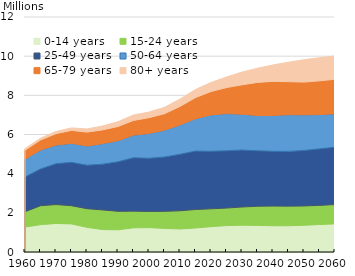
| Category | 0-14 years | 15-24 years | 25-49 years | 50-64 years | 65-79 years | 80+ years |
|---|---|---|---|---|---|---|
| 1960.0 | 1.274 | 0.781 | 1.777 | 0.91 | 0.458 | 0.081 |
| 1965.0 | 1.397 | 0.965 | 1.878 | 0.964 | 0.514 | 0.094 |
| 1970.0 | 1.457 | 0.965 | 2.09 | 0.946 | 0.585 | 0.108 |
| 1975.0 | 1.435 | 0.929 | 2.215 | 0.971 | 0.659 | 0.128 |
| 1980.0 | 1.257 | 0.955 | 2.221 | 0.98 | 0.709 | 0.161 |
| 1985.0 | 1.146 | 1.003 | 2.338 | 1.047 | 0.701 | 0.2 |
| 1990.0 | 1.134 | 0.945 | 2.529 | 1.075 | 0.727 | 0.243 |
| 1995.0 | 1.234 | 0.852 | 2.728 | 1.154 | 0.75 | 0.277 |
| 2000.0 | 1.246 | 0.825 | 2.716 | 1.266 | 0.806 | 0.284 |
| 2005.0 | 1.203 | 0.873 | 2.776 | 1.368 | 0.842 | 0.324 |
| 2010.0 | 1.176 | 0.929 | 2.886 | 1.499 | 0.944 | 0.375 |
| 2015.0 | 1.227 | 0.942 | 2.983 | 1.651 | 1.08 | 0.413 |
| 2020.0 | 1.295 | 0.909 | 2.941 | 1.856 | 1.194 | 0.459 |
| 2025.0 | 1.349 | 0.895 | 2.926 | 1.9 | 1.327 | 0.541 |
| 2030.0 | 1.369 | 0.929 | 2.909 | 1.829 | 1.499 | 0.649 |
| 2035.0 | 1.356 | 0.979 | 2.836 | 1.795 | 1.693 | 0.726 |
| 2040.0 | 1.341 | 1.005 | 2.797 | 1.833 | 1.74 | 0.837 |
| 2045.0 | 1.341 | 1.001 | 2.796 | 1.873 | 1.687 | 0.996 |
| 2050.0 | 1.365 | 0.986 | 2.834 | 1.82 | 1.672 | 1.14 |
| 2055.0 | 1.403 | 0.977 | 2.887 | 1.753 | 1.719 | 1.183 |
| 2060.0 | 1.438 | 0.985 | 2.926 | 1.706 | 1.766 | 1.19 |